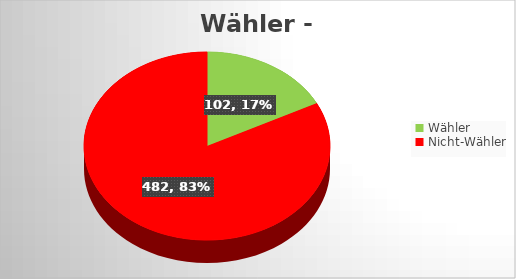
| Category | Series 0 |
|---|---|
| Wähler | 102 |
| Nicht-Wähler | 482 |